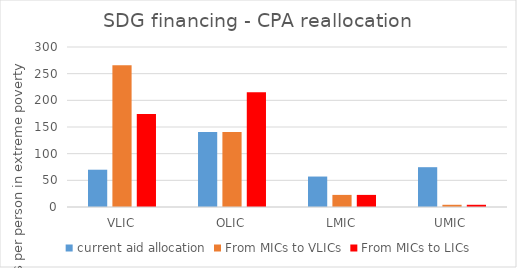
| Category | current aid allocation | From MICs to VLICs | From MICs to LICs |
|---|---|---|---|
| VLIC | 69.919 | 265.983 | 174.181 |
| OLIC | 140.795 | 140.795 | 215.184 |
| LMIC | 57.113 | 22.692 | 22.692 |
| UMIC | 74.645 | 4.168 | 4.168 |